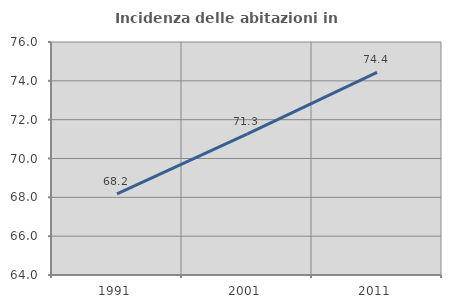
| Category | Incidenza delle abitazioni in proprietà  |
|---|---|
| 1991.0 | 68.177 |
| 2001.0 | 71.259 |
| 2011.0 | 74.441 |